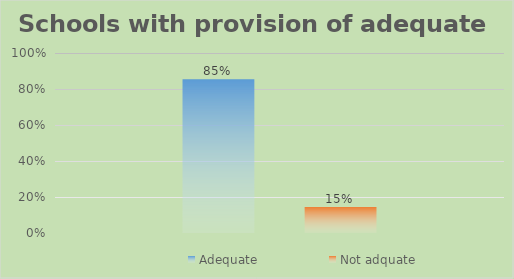
| Category | Adequate | Not adquate |
|---|---|---|
| 0 | 0.855 | 0.145 |